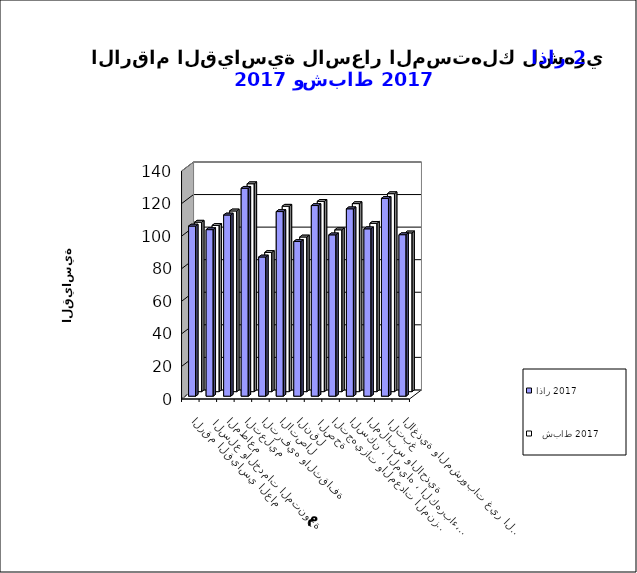
| Category | اذار 2017      |   شباط 2017       |
|---|---|---|
| الاغذية والمشروبات غير الكحولية | 99.2 | 97.5 |
|  التبغ | 121.5 | 121.6 |
| الملابس والاحذية | 102.8 | 103.4 |
| السكن ، المياه ، الكهرباء، الغاز  | 115.1 | 115.5 |
| التجهيزات والمعدات المنزلية والصيانة | 99.1 | 99.4 |
|  الصحة | 117.1 | 116.9 |
| النقل | 95 | 95 |
| الاتصال | 113.4 | 113.9 |
| الترفيه والثقافة | 85.5 | 85.5 |
| التعليم | 127.7 | 127.7 |
| المطاعم  | 111.3 | 111 |
|  السلع والخدمات المتنوعة | 102.3 | 102.1 |
| الرقم القياسي العام | 104.5 | 104.1 |